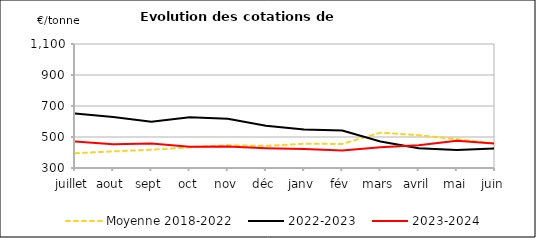
| Category | Moyenne 2018-2022 | 2022-2023 | 2023-2024 |
|---|---|---|---|
| juillet | 395.508 | 652.333 | 471.17 |
| aout | 407.183 | 628.5 | 453 |
| sept | 417.925 | 598.7 | 458 |
| oct | 433.325 | 627.375 | 437.38 |
| nov | 446.623 | 617 | 438 |
| déc | 442.733 | 572.667 | 428 |
| janv | 456.5 | 548.875 | 423.125 |
| fév | 455.25 | 541.25 | 413.6 |
| mars | 528.125 | 471.1 | 433.5 |
| avril | 511.867 | 427.167 | 446.88 |
| mai | 485.417 | 416.167 | 475.67 |
| juin | 458.39 | 426.5 | 457 |